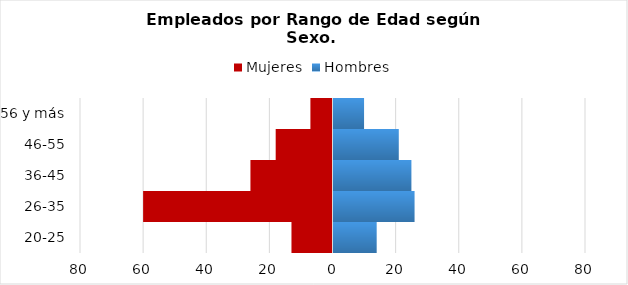
| Category | Mujeres | Hombres |
|---|---|---|
| 20-25 | -13 | 14 |
| 26-35 | -60 | 26 |
| 36-45 | -26 | 25 |
| 46-55 | -18 | 21 |
| 56 y más | -7 | 10 |